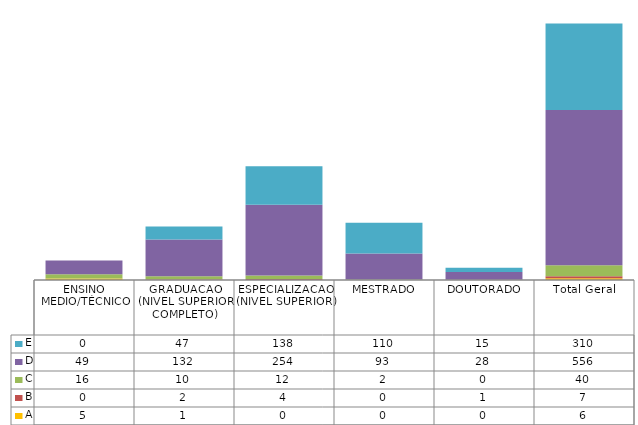
| Category | A | B | C | D | E |
|---|---|---|---|---|---|
| ENSINO MEDIO/TÉCNICO | 5 | 0 | 16 | 49 | 0 |
| GRADUACAO (NIVEL SUPERIOR COMPLETO) | 1 | 2 | 10 | 132 | 47 |
| ESPECIALIZACAO (NIVEL SUPERIOR) | 0 | 4 | 12 | 254 | 138 |
| MESTRADO | 0 | 0 | 2 | 93 | 110 |
| DOUTORADO | 0 | 1 | 0 | 28 | 15 |
| Total Geral | 6 | 7 | 40 | 556 | 310 |